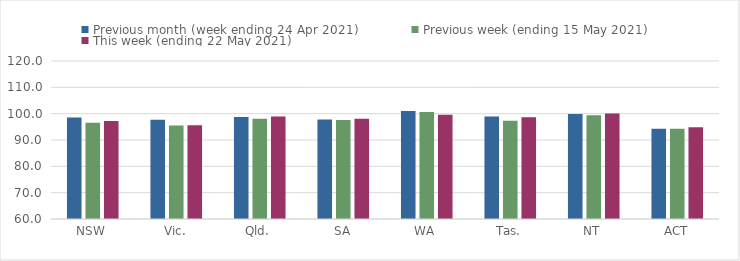
| Category | Previous month (week ending 24 Apr 2021) | Previous week (ending 15 May 2021) | This week (ending 22 May 2021) |
|---|---|---|---|
| NSW | 98.58 | 96.56 | 97.25 |
| Vic. | 97.67 | 95.46 | 95.6 |
| Qld. | 98.75 | 98.05 | 98.97 |
| SA | 97.74 | 97.62 | 98.07 |
| WA | 101.04 | 100.59 | 99.62 |
| Tas. | 98.94 | 97.31 | 98.63 |
| NT | 99.88 | 99.39 | 100.02 |
| ACT | 94.28 | 94.31 | 94.84 |